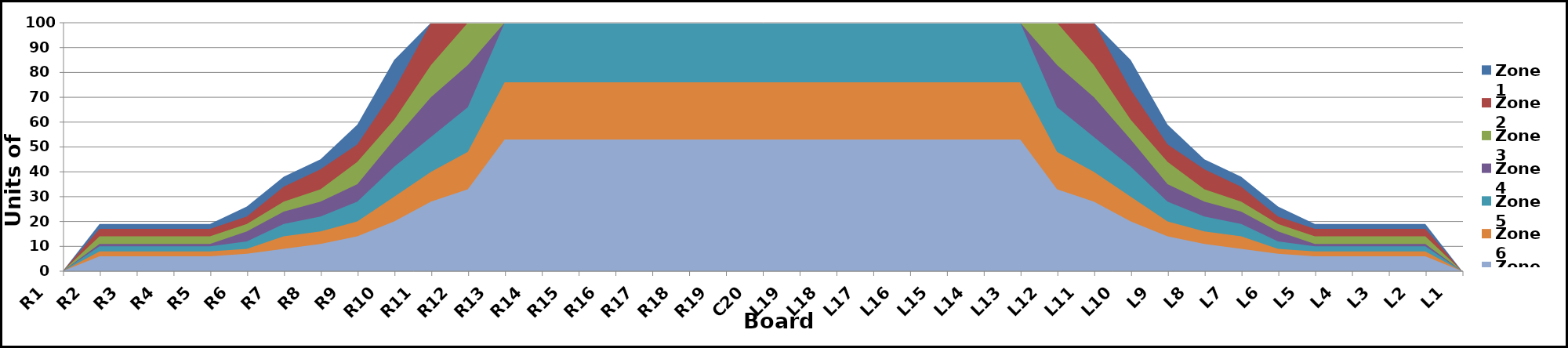
| Category | Zone 1 | Zone 2 | Zone 3 | Zone 4 | Zone 5 | Zone 6 | Zone 7 | Zone 8 |
|---|---|---|---|---|---|---|---|---|
| L1 | 0 | 0 | 0 | 0 | 0 | 0 | 0 | 0 |
| L2 | 19 | 17 | 14 | 11 | 10 | 8 | 6 | 0 |
| L3 | 19 | 17 | 14 | 11 | 10 | 8 | 6 | 0 |
| L4 | 19 | 17 | 14 | 11 | 10 | 8 | 6 | 0 |
| L5 | 19 | 17 | 14 | 11 | 10 | 8 | 6 | 0 |
| L6 | 26 | 22 | 19 | 16 | 12 | 9 | 7 | 0 |
| L7 | 38 | 34 | 28 | 24 | 19 | 14 | 9 | 0 |
| L8 | 45 | 41 | 33 | 28 | 22 | 16 | 11 | 0 |
| L9 | 59 | 51 | 44 | 35 | 28 | 20 | 14 | 0 |
| L10 | 85 | 73 | 61 | 53 | 42 | 30 | 20 | 0 |
| L11 | 100 | 100 | 83 | 70 | 54 | 40 | 28 | 0 |
| L12 | 100 | 100 | 100 | 83 | 66 | 48 | 33 | 0 |
| L13 | 100 | 100 | 100 | 100 | 100 | 76 | 53 | 0 |
| L14 | 100 | 100 | 100 | 100 | 100 | 76 | 53 | 0 |
| L15 | 100 | 100 | 100 | 100 | 100 | 76 | 53 | 0 |
| L16 | 100 | 100 | 100 | 100 | 100 | 76 | 53 | 0 |
| L17 | 100 | 100 | 100 | 100 | 100 | 76 | 53 | 0 |
| L18 | 100 | 100 | 100 | 100 | 100 | 76 | 53 | 0 |
| L19 | 100 | 100 | 100 | 100 | 100 | 76 | 53 | 0 |
| C20 | 100 | 100 | 100 | 100 | 100 | 76 | 53 | 0 |
| R19 | 100 | 100 | 100 | 100 | 100 | 76 | 53 | 0 |
| R18 | 100 | 100 | 100 | 100 | 100 | 76 | 53 | 0 |
| R17 | 100 | 100 | 100 | 100 | 100 | 76 | 53 | 0 |
| R16 | 100 | 100 | 100 | 100 | 100 | 76 | 53 | 0 |
| R15 | 100 | 100 | 100 | 100 | 100 | 76 | 53 | 0 |
| R14 | 100 | 100 | 100 | 100 | 100 | 76 | 53 | 0 |
| R13 | 100 | 100 | 100 | 100 | 100 | 76 | 53 | 0 |
| R12 | 100 | 100 | 100 | 83 | 66 | 48 | 33 | 0 |
| R11 | 100 | 100 | 83 | 70 | 54 | 40 | 28 | 0 |
| R10 | 85 | 73 | 61 | 53 | 42 | 30 | 20 | 0 |
| R9 | 59 | 51 | 44 | 35 | 28 | 20 | 14 | 0 |
| R8 | 45 | 41 | 33 | 28 | 22 | 16 | 11 | 0 |
| R7 | 38 | 34 | 28 | 24 | 19 | 14 | 9 | 0 |
| R6 | 26 | 22 | 19 | 16 | 12 | 9 | 7 | 0 |
| R5 | 19 | 17 | 14 | 11 | 10 | 8 | 6 | 0 |
| R4 | 19 | 17 | 14 | 11 | 10 | 8 | 6 | 0 |
| R3 | 19 | 17 | 14 | 11 | 10 | 8 | 6 | 0 |
| R2 | 19 | 17 | 14 | 11 | 10 | 8 | 6 | 0 |
| R1 | 0 | 0 | 0 | 0 | 0 | 0 | 0 | 0 |